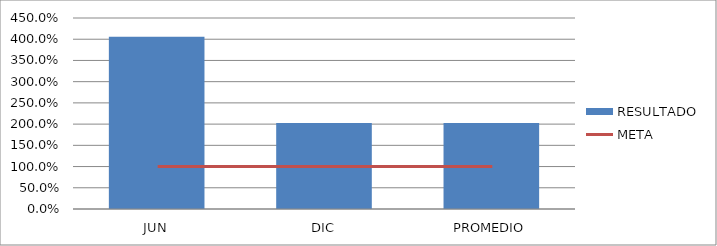
| Category | RESULTADO |
|---|---|
| JUN | 4.056 |
| DIC | 2.028 |
| PROMEDIO | 2.028 |